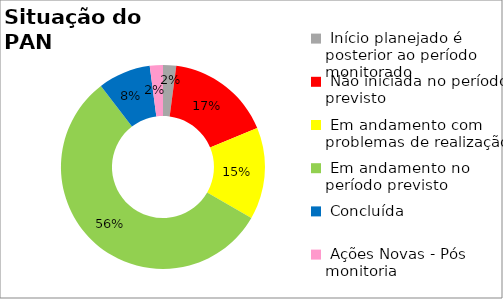
| Category | Series 0 |
|---|---|
|  Início planejado é posterior ao período monitorado | 0.021 |
|  Não iniciada no período previsto | 0.167 |
|  Em andamento com problemas de realização | 0.146 |
|  Em andamento no período previsto  | 0.562 |
|  Concluída | 0.083 |
|  Ações Novas - Pós monitoria | 0.021 |